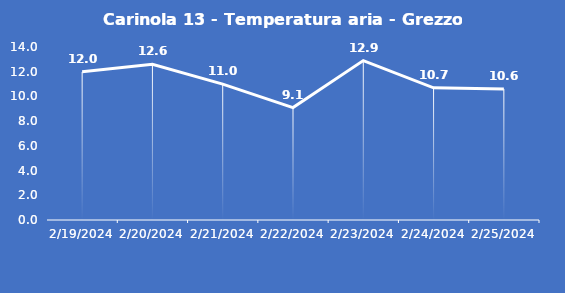
| Category | Carinola 13 - Temperatura aria - Grezzo (°C) |
|---|---|
| 2/19/24 | 12 |
| 2/20/24 | 12.6 |
| 2/21/24 | 11 |
| 2/22/24 | 9.1 |
| 2/23/24 | 12.9 |
| 2/24/24 | 10.7 |
| 2/25/24 | 10.6 |